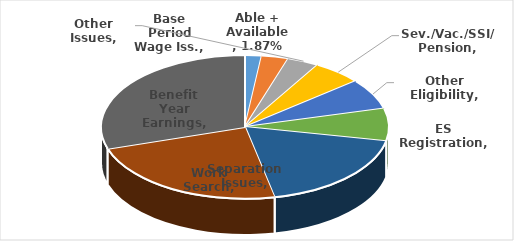
| Category | Series 0 |
|---|---|
| Able + Available | 0.019 |
| Base Period Wage Iss. | 0.03 |
| Other Issues | 0.036 |
| Sev./Vac./SSI/ Pension | 0.056 |
| Other Eligibility | 0.069 |
| ES Registration | 0.073 |
| Separation Issues | 0.185 |
| Work Search | 0.234 |
| Benefit Year Earnings | 0.299 |